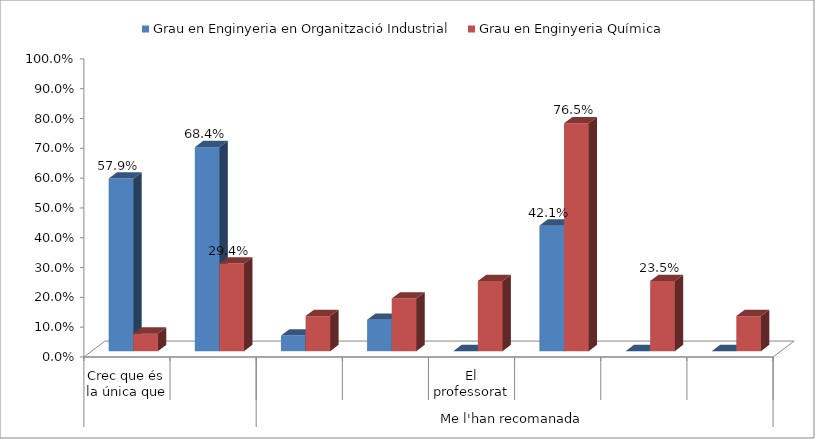
| Category | Grau en Enginyeria en Organització Industrial | Grau en Enginyeria Química |
|---|---|---|
| 0 | 0.579 | 0.059 |
| 1 | 0.684 | 0.294 |
| 2 | 0.053 | 0.118 |
| 3 | 0.105 | 0.176 |
| 4 | 0 | 0.235 |
| 5 | 0.421 | 0.765 |
| 6 | 0 | 0.235 |
| 7 | 0 | 0.118 |